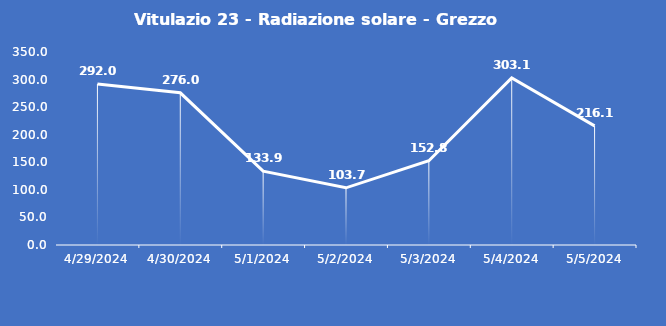
| Category | Vitulazio 23 - Radiazione solare - Grezzo (W/m2) |
|---|---|
| 4/29/24 | 292 |
| 4/30/24 | 276 |
| 5/1/24 | 133.9 |
| 5/2/24 | 103.7 |
| 5/3/24 | 152.8 |
| 5/4/24 | 303.1 |
| 5/5/24 | 216.1 |